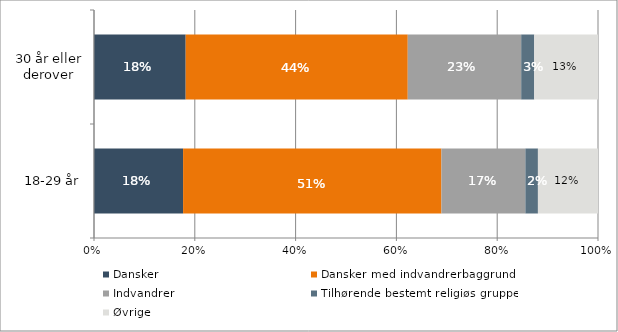
| Category | Dansker | Dansker med indvandrerbaggrund | Indvandrer | Tilhørende bestemt religiøs gruppe | Øvrige |
|---|---|---|---|---|---|
| 18-29 år | 0.177 | 0.513 | 0.167 | 0.025 | 0.119 |
| 30 år eller derover | 0.182 | 0.441 | 0.225 | 0.026 | 0.127 |